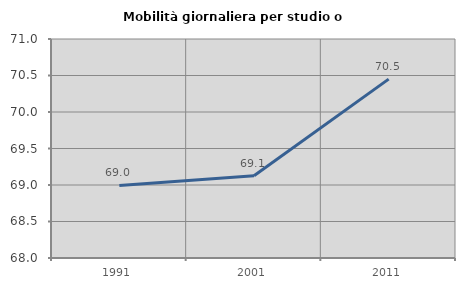
| Category | Mobilità giornaliera per studio o lavoro |
|---|---|
| 1991.0 | 68.994 |
| 2001.0 | 69.126 |
| 2011.0 | 70.45 |